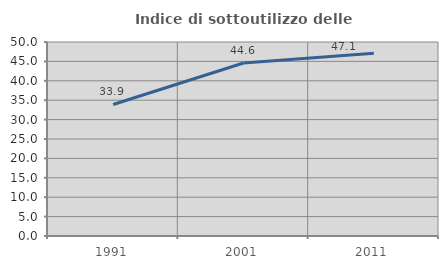
| Category | Indice di sottoutilizzo delle abitazioni  |
|---|---|
| 1991.0 | 33.906 |
| 2001.0 | 44.578 |
| 2011.0 | 47.083 |